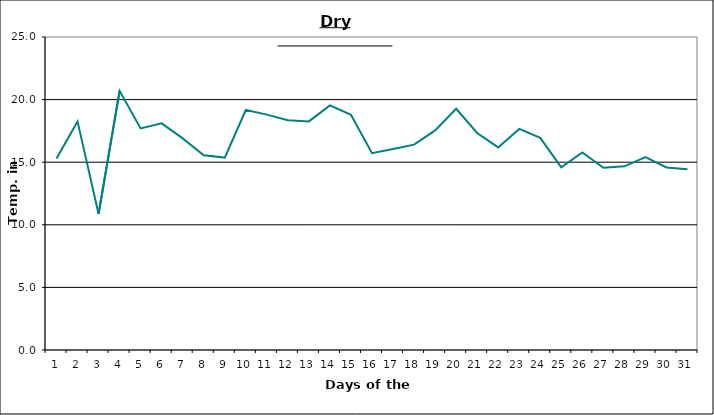
| Category | Series 0 |
|---|---|
| 0 | 15.3 |
| 1 | 18.26 |
| 2 | 10.86 |
| 3 | 20.7 |
| 4 | 17.7 |
| 5 | 18.1 |
| 6 | 16.9 |
| 7 | 15.56 |
| 8 | 15.37 |
| 9 | 19.17 |
| 10 | 18.8 |
| 11 | 18.36 |
| 12 | 18.26 |
| 13 | 19.54 |
| 14 | 18.78 |
| 15 | 15.72 |
| 16 | 16.05 |
| 17 | 16.4 |
| 18 | 17.54 |
| 19 | 19.27 |
| 20 | 17.33 |
| 21 | 16.18 |
| 22 | 17.66 |
| 23 | 16.94 |
| 24 | 14.59 |
| 25 | 15.78 |
| 26 | 14.55 |
| 27 | 14.67 |
| 28 | 15.4 |
| 29 | 14.58 |
| 30 | 14.43 |